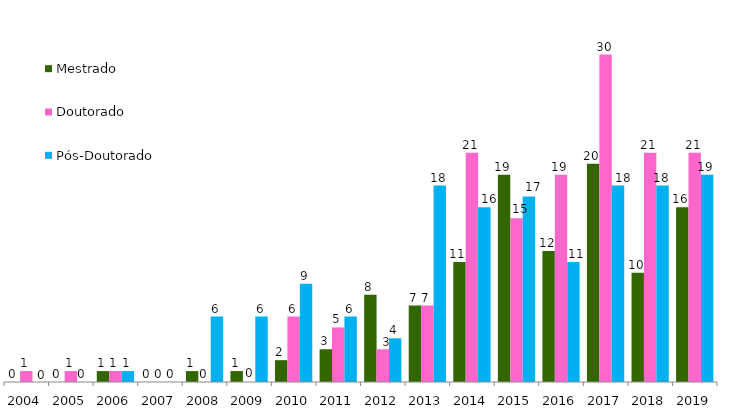
| Category | Mestrado | Doutorado  | Pós-Doutorado  |
|---|---|---|---|
| 2004.0 | 0 | 1 | 0 |
| 2005.0 | 0 | 1 | 0 |
| 2006.0 | 1 | 1 | 1 |
| 2007.0 | 0 | 0 | 0 |
| 2008.0 | 1 | 0 | 6 |
| 2009.0 | 1 | 0 | 6 |
| 2010.0 | 2 | 6 | 9 |
| 2011.0 | 3 | 5 | 6 |
| 2012.0 | 8 | 3 | 4 |
| 2013.0 | 7 | 7 | 18 |
| 2014.0 | 11 | 21 | 16 |
| 2015.0 | 19 | 15 | 17 |
| 2016.0 | 12 | 19 | 11 |
| 2017.0 | 20 | 30 | 18 |
| 2018.0 | 10 | 21 | 18 |
| 2019.0 | 16 | 21 | 19 |